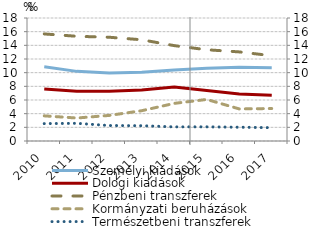
| Category | Személyi kiadások  | Dologi kiadások  | Pénzbeni transzferek | Kormányzati beruházások |
|---|---|---|---|---|
| 2010.0 | 10.853 | 7.625 | 15.667 | 3.681 |
| 2011.0 | 10.189 | 7.266 | 15.324 | 3.362 |
| 2012.0 | 9.954 | 7.266 | 15.184 | 3.743 |
| 2013.0 | 10.072 | 7.471 | 14.812 | 4.433 |
| 2014.0 | 10.378 | 7.884 | 13.957 | 5.505 |
| 2015.0 | 10.648 | 7.391 | 13.355 | 6.082 |
| 2016.0 | 10.797 | 6.866 | 13.037 | 4.693 |
| 2017.0 | 10.721 | 6.697 | 12.483 | 4.755 |